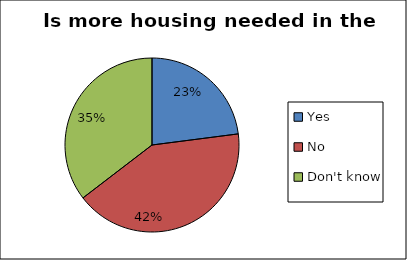
| Category | Series 0 |
|---|---|
| Yes | 0.23 |
| No | 0.416 |
| Don't know | 0.354 |